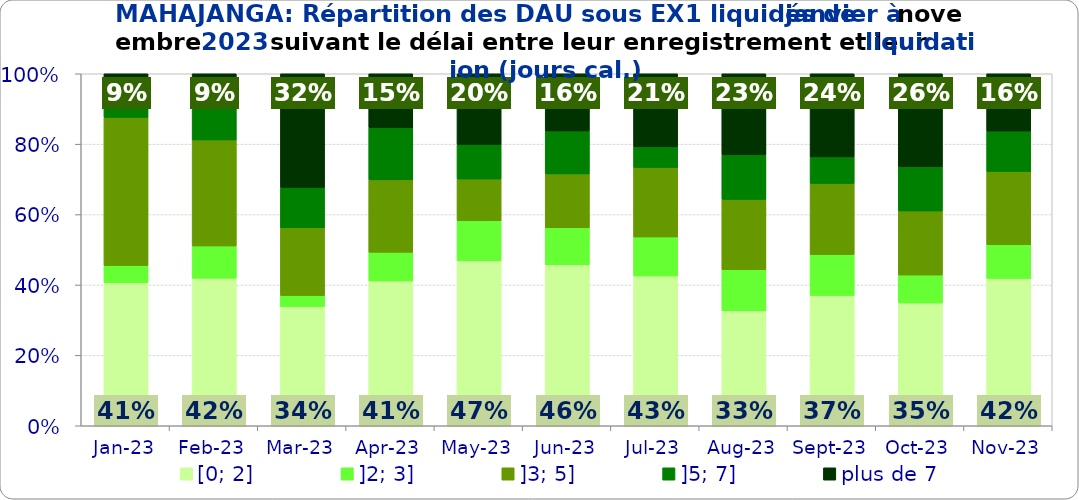
| Category | [0; 2] | ]2; 3] | ]3; 5] | ]5; 7] | plus de 7 |
|---|---|---|---|---|---|
| 2023-01-01 | 0.407 | 0.048 | 0.421 | 0.034 | 0.09 |
| 2023-02-01 | 0.419 | 0.091 | 0.301 | 0.102 | 0.086 |
| 2023-03-01 | 0.339 | 0.031 | 0.193 | 0.115 | 0.323 |
| 2023-04-01 | 0.411 | 0.081 | 0.206 | 0.148 | 0.153 |
| 2023-05-01 | 0.469 | 0.114 | 0.118 | 0.098 | 0.201 |
| 2023-06-01 | 0.458 | 0.105 | 0.153 | 0.122 | 0.163 |
| 2023-07-01 | 0.426 | 0.111 | 0.197 | 0.059 | 0.208 |
| 2023-08-01 | 0.326 | 0.117 | 0.199 | 0.127 | 0.23 |
| 2023-09-01 | 0.37 | 0.116 | 0.202 | 0.075 | 0.236 |
| 2023-10-01 | 0.349 | 0.079 | 0.182 | 0.126 | 0.264 |
| 2023-11-01 | 0.419 | 0.096 | 0.208 | 0.115 | 0.163 |